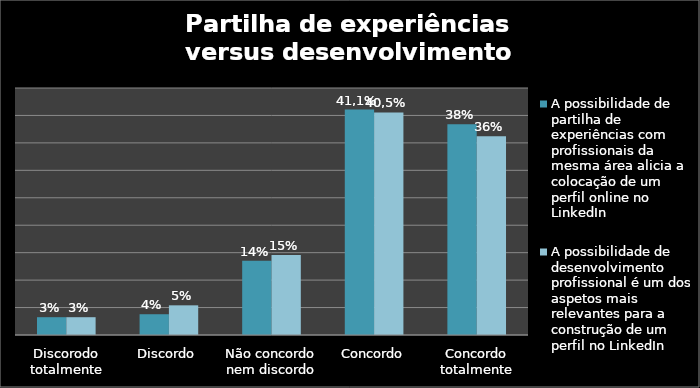
| Category | A possibilidade de partilha de experiências com profissionais da mesma área alicia a colocação de um perfil online no LinkedIn | A possibilidade de desenvolvimento profissional é um dos aspetos mais relevantes para a construção de um perfil no LinkedIn |
|---|---|---|
| Discorodo totalmente | 3.243 | 3.243 |
| Discordo | 3.784 | 5.405 |
| Não concordo nem discordo | 13.514 | 14.595 |
| Concordo | 41.081 | 40.541 |
| Concordo totalmente | 38.378 | 36.216 |